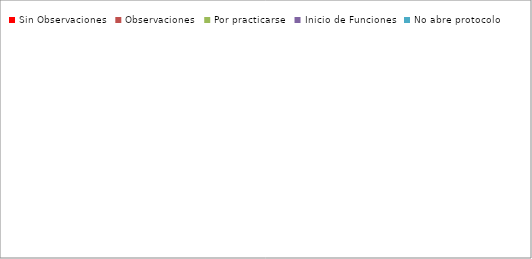
| Category | Series 0 |
|---|---|
| Sin Observaciones | 117 |
| Observaciones | 36 |
| Por practicarse | 56 |
| Inicio de Funciones | 2 |
| No abre protocolo | 4 |